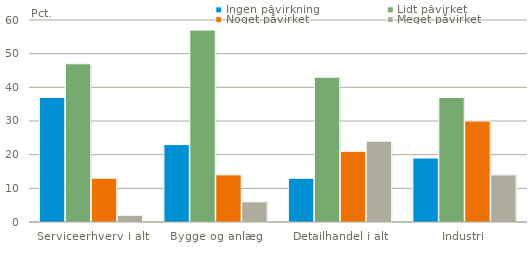
| Category | Ingen påvirkning | Lidt påvirket | Noget påvirket | Meget påvirket |
|---|---|---|---|---|
| Serviceerhverv i alt | 37 | 47 | 13 | 2 |
| Bygge og anlæg | 23 | 57 | 14 | 6 |
| Detailhandel i alt | 13 | 43 | 21 | 24 |
| Industri | 19 | 37 | 30 | 14 |